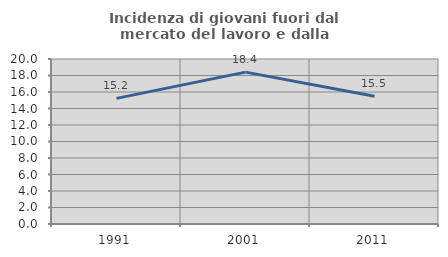
| Category | Incidenza di giovani fuori dal mercato del lavoro e dalla formazione  |
|---|---|
| 1991.0 | 15.225 |
| 2001.0 | 18.41 |
| 2011.0 | 15.485 |